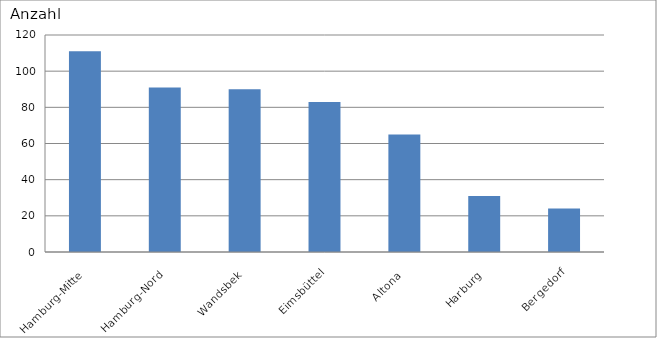
| Category | Hamburg-Mitte Hamburg-Nord Wandsbek Eimsbüttel Altona Harburg Bergedorf |
|---|---|
| Hamburg-Mitte | 111 |
| Hamburg-Nord | 91 |
| Wandsbek | 90 |
| Eimsbüttel | 83 |
| Altona | 65 |
| Harburg | 31 |
| Bergedorf | 24 |